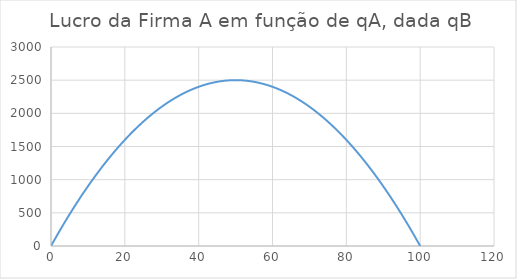
| Category | Series 0 |
|---|---|
| 0.0 | 0 |
| 1.0 | 99 |
| 2.0 | 196 |
| 3.0 | 291 |
| 4.0 | 384 |
| 5.0 | 475 |
| 6.0 | 564 |
| 7.0 | 651 |
| 8.0 | 736 |
| 9.0 | 819 |
| 10.0 | 900 |
| 11.0 | 979 |
| 12.0 | 1056 |
| 13.0 | 1131 |
| 14.0 | 1204 |
| 15.0 | 1275 |
| 16.0 | 1344 |
| 17.0 | 1411 |
| 18.0 | 1476 |
| 19.0 | 1539 |
| 20.0 | 1600 |
| 21.0 | 1659 |
| 22.0 | 1716 |
| 23.0 | 1771 |
| 24.0 | 1824 |
| 25.0 | 1875 |
| 26.0 | 1924 |
| 27.0 | 1971 |
| 28.0 | 2016 |
| 29.0 | 2059 |
| 30.0 | 2100 |
| 31.0 | 2139 |
| 32.0 | 2176 |
| 33.0 | 2211 |
| 34.0 | 2244 |
| 35.0 | 2275 |
| 36.0 | 2304 |
| 37.0 | 2331 |
| 38.0 | 2356 |
| 39.0 | 2379 |
| 40.0 | 2400 |
| 41.0 | 2419 |
| 42.0 | 2436 |
| 43.0 | 2451 |
| 44.0 | 2464 |
| 45.0 | 2475 |
| 46.0 | 2484 |
| 47.0 | 2491 |
| 48.0 | 2496 |
| 49.0 | 2499 |
| 50.0 | 2500 |
| 51.0 | 2499 |
| 52.0 | 2496 |
| 53.0 | 2491 |
| 54.0 | 2484 |
| 55.0 | 2475 |
| 56.0 | 2464 |
| 57.0 | 2451 |
| 58.0 | 2436 |
| 59.0 | 2419 |
| 60.0 | 2400 |
| 61.0 | 2379 |
| 62.0 | 2356 |
| 63.0 | 2331 |
| 64.0 | 2304 |
| 65.0 | 2275 |
| 66.0 | 2244 |
| 67.0 | 2211 |
| 68.0 | 2176 |
| 69.0 | 2139 |
| 70.0 | 2100 |
| 71.0 | 2059 |
| 72.0 | 2016 |
| 73.0 | 1971 |
| 74.0 | 1924 |
| 75.0 | 1875 |
| 76.0 | 1824 |
| 77.0 | 1771 |
| 78.0 | 1716 |
| 79.0 | 1659 |
| 80.0 | 1600 |
| 81.0 | 1539 |
| 82.0 | 1476 |
| 83.0 | 1411 |
| 84.0 | 1344 |
| 85.0 | 1275 |
| 86.0 | 1204 |
| 87.0 | 1131 |
| 88.0 | 1056 |
| 89.0 | 979 |
| 90.0 | 900 |
| 91.0 | 819 |
| 92.0 | 736 |
| 93.0 | 651 |
| 94.0 | 564 |
| 95.0 | 475 |
| 96.0 | 384 |
| 97.0 | 291 |
| 98.0 | 196 |
| 99.0 | 99 |
| 100.0 | 0 |